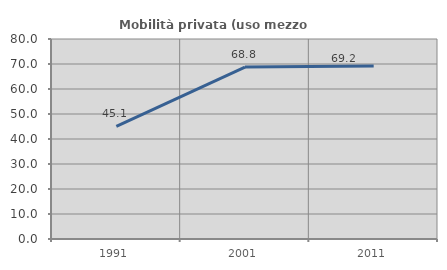
| Category | Mobilità privata (uso mezzo privato) |
|---|---|
| 1991.0 | 45.083 |
| 2001.0 | 68.777 |
| 2011.0 | 69.224 |